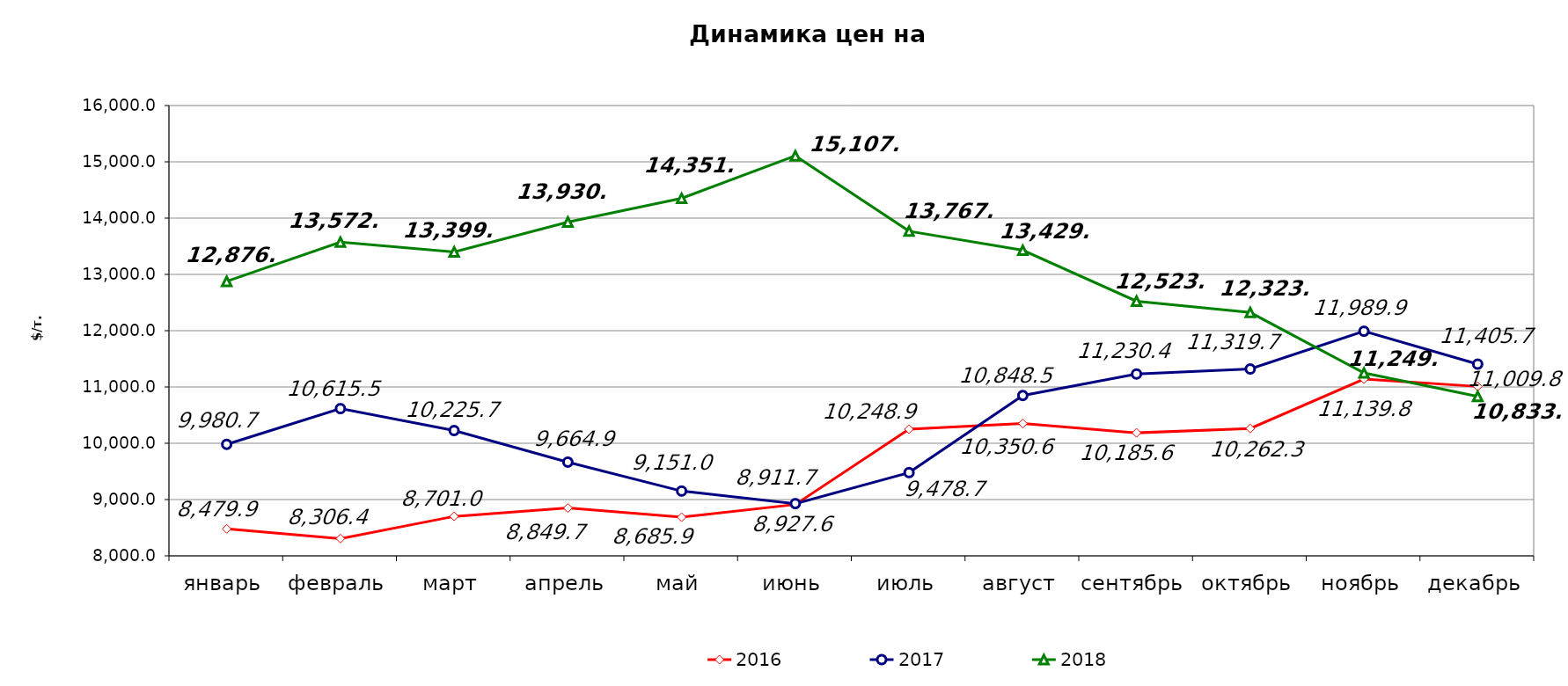
| Category | 2016 | 2017 | 2018 |
|---|---|---|---|
| январь | 8479.88 | 9980.72 | 12876.03 |
| февраль | 8306.427 | 10615.53 | 13572.75 |
| март | 8700.954 | 10225.65 | 13399.76 |
| апрель | 8849.65 | 9664.86 | 13930.75 |
| май | 8685.88 | 9150.96 | 14351.67 |
| июнь | 8911.702 | 8927.62 | 15107.03 |
| июль | 10248.927 | 9478.69 | 13767.73 |
| август | 10350.567 | 10848.52 | 13429.2 |
| сентябрь | 10185.57 | 11230.36 | 12523.875 |
| октябрь | 10262.27 | 11319.66 | 12323.152 |
| ноябрь | 11139.772 | 11989.89 | 11249.21 |
| декабрь | 11009.75 | 11405.66 | 10833.291 |